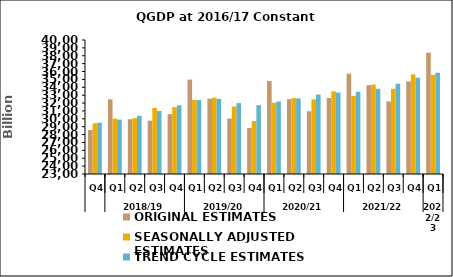
| Category | ORIGINAL ESTIMATES | SEASONALLY ADJUSTED ESTIMATES | TREND CYCLE ESTIMATES |
|---|---|---|---|
| 0 | 28583.712 | 29433.585 | 29511.462 |
| 1 | 32469.344 | 30024.888 | 29905.72 |
| 2 | 29951.268 | 30088.755 | 30383.609 |
| 3 | 29774.256 | 31388.488 | 30987.193 |
| 4 | 30591.734 | 31487.618 | 31716.021 |
| 5 | 34983.74 | 32406.832 | 32377.184 |
| 6 | 32552.043 | 32678.643 | 32520.063 |
| 7 | 30039.538 | 31560.917 | 31992.965 |
| 8 | 28835.091 | 29729.333 | 31733.058 |
| 9 | 34793.886 | 32033.665 | 32191.562 |
| 10 | 32489.128 | 32624.441 | 32583.536 |
| 11 | 30959.054 | 32471.206 | 33073.958 |
| 12 | 32638.951 | 33488.858 | 33340.571 |
| 13 | 35735.64 | 32912.101 | 33439.37 |
| 14 | 34272.587 | 34342.933 | 33814.495 |
| 15 | 32208.223 | 33812.712 | 34453.717 |
| 16 | 34750.711 | 35631.793 | 35211.435 |
| 17 | 38407.607 | 35584.047 | 35847.78 |